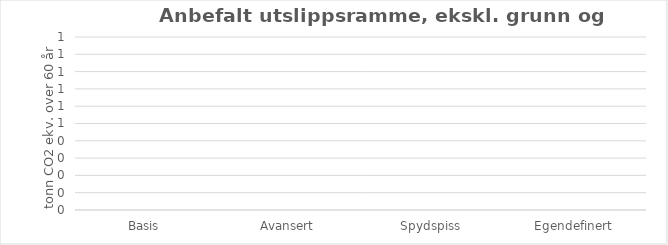
| Category | Tonn CO2-ekv. over 60 år |
|---|---|
| Basis | 0 |
| Avansert | 0 |
| Spydspiss | 0 |
| Egendefinert | 0 |